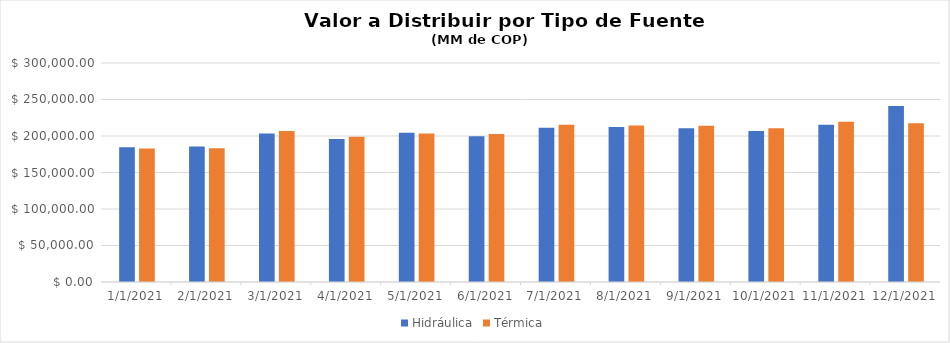
| Category | Hidráulica | Térmica |
|---|---|---|
| 1/1/21 | 184494.375 | 182958.833 |
| 2/1/21 | 185727.726 | 183102.091 |
| 3/1/21 | 203363.994 | 206928.568 |
| 4/1/21 | 195871.778 | 199009.066 |
| 5/1/21 | 204309.455 | 203305.965 |
| 6/1/21 | 199628.702 | 202787.852 |
| 7/1/21 | 211221.884 | 215297.056 |
| 8/1/21 | 212355.029 | 214493.211 |
| 9/1/21 | 210696.211 | 213926.718 |
| 10/1/21 | 206737.224 | 210748.591 |
| 11/1/21 | 215251.635 | 219655.092 |
| 12/1/21 | 240969.243 | 217609.468 |